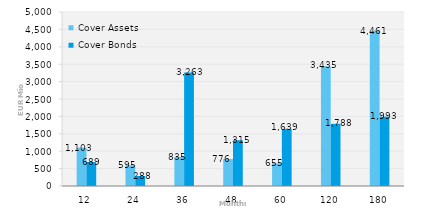
| Category | Cover Assets | Cover Bonds |
|---|---|---|
| 12.0 | 1102.989 | 688.874 |
| 24.0 | 594.691 | 288.19 |
| 36.0 | 835.18 | 3263 |
| 48.0 | 776.231 | 1315.355 |
| 60.0 | 654.616 | 1638.914 |
| 120.0 | 3434.655 | 1787.639 |
| 180.0 | 4461.176 | 1993.393 |